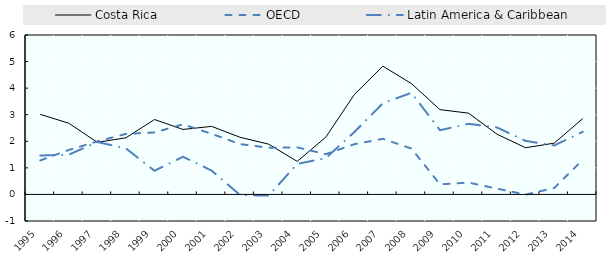
| Category | Costa Rica | OECD | Latin America & Caribbean |
|---|---|---|---|
| 1995.0 | 3.013 | 1.28 | 1.464 |
| 1996.0 | 2.679 | 1.673 | 1.498 |
| 1997.0 | 1.96 | 1.996 | 1.972 |
| 1998.0 | 2.132 | 2.277 | 1.732 |
| 1999.0 | 2.819 | 2.333 | 0.892 |
| 2000.0 | 2.446 | 2.637 | 1.417 |
| 2001.0 | 2.561 | 2.281 | 0.898 |
| 2002.0 | 2.15 | 1.892 | -0.024 |
| 2003.0 | 1.892 | 1.76 | -0.046 |
| 2004.0 | 1.243 | 1.769 | 1.15 |
| 2005.0 | 2.154 | 1.515 | 1.365 |
| 2006.0 | 3.759 | 1.889 | 2.347 |
| 2007.0 | 4.827 | 2.093 | 3.431 |
| 2008.0 | 4.172 | 1.727 | 3.824 |
| 2009.0 | 3.191 | 0.38 | 2.416 |
| 2010.0 | 3.059 | 0.445 | 2.658 |
| 2011.0 | 2.265 | 0.218 | 2.518 |
| 2012.0 | 1.758 | -0.006 | 2.016 |
| 2013.0 | 1.93 | 0.242 | 1.842 |
| 2014.0 | 2.854 | 1.299 | 2.355 |